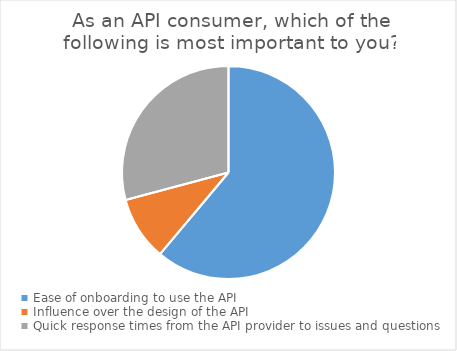
| Category | Series 0 |
|---|---|
| Ease of onboarding to use the API | 44 |
| Influence over the design of the API | 7 |
| Quick response times from the API provider to issues and questions | 21 |